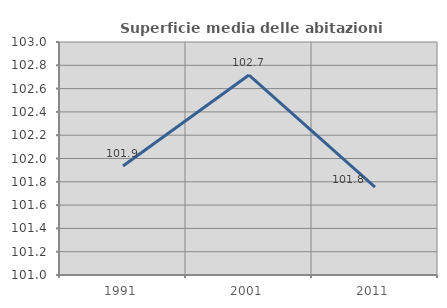
| Category | Superficie media delle abitazioni occupate |
|---|---|
| 1991.0 | 101.935 |
| 2001.0 | 102.716 |
| 2011.0 | 101.754 |